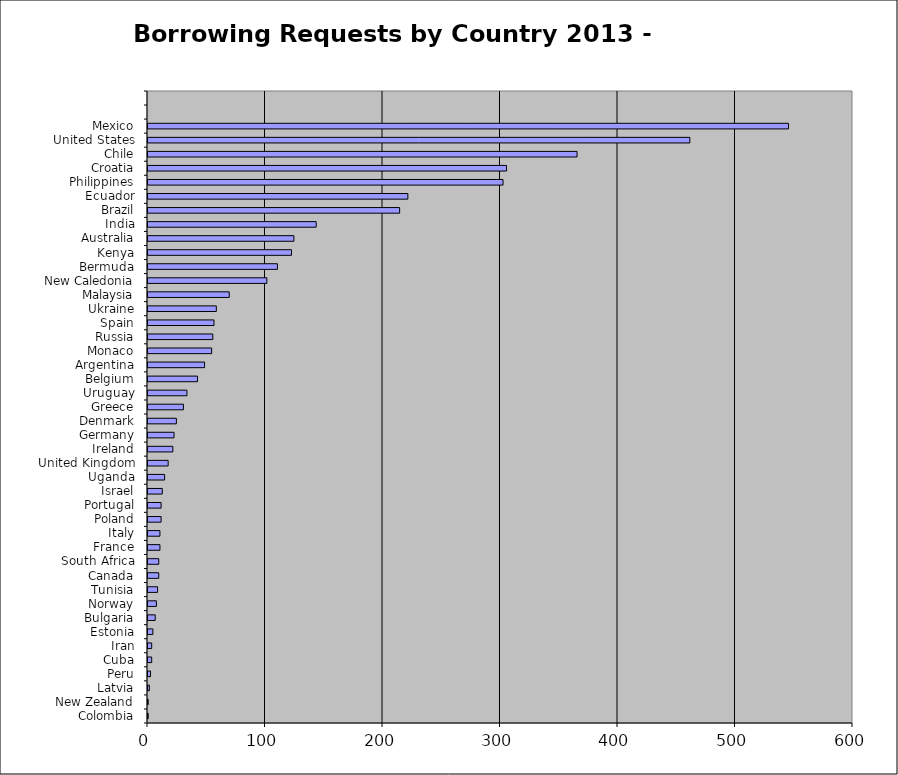
| Category | Series 0 |
|---|---|
| Colombia | 1 |
| New Zealand | 1 |
| Latvia | 2 |
| Peru | 3 |
| Cuba | 4 |
| Iran | 4 |
| Estonia | 5 |
| Bulgaria | 7 |
| Norway | 8 |
| Tunisia | 9 |
| Canada | 10 |
| South Africa | 10 |
| France | 11 |
| Italy | 11 |
| Poland | 12 |
| Portugal | 12 |
| Israel | 13 |
| Uganda | 15 |
| United Kingdom | 18 |
| Ireland | 22 |
| Germany | 23 |
| Denmark | 25 |
| Greece | 31 |
| Uruguay | 34 |
| Belgium | 43 |
| Argentina | 49 |
| Monaco | 55 |
| Russia | 56 |
| Spain | 57 |
| Ukraine | 59 |
| Malaysia | 70 |
| New Caledonia | 102 |
| Bermuda | 111 |
| Kenya | 123 |
| Australia | 125 |
| India | 144 |
| Brazil | 215 |
| Ecuador | 222 |
| Philippines | 303 |
| Croatia | 306 |
| Chile | 366 |
| United States | 462 |
| Mexico | 546 |